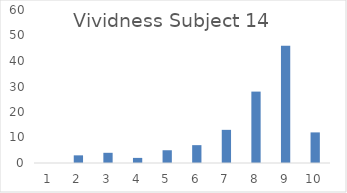
| Category | Frequency |
|---|---|
| 0 | 0 |
| 1 | 3 |
| 2 | 4 |
| 3 | 2 |
| 4 | 5 |
| 5 | 7 |
| 6 | 13 |
| 7 | 28 |
| 8 | 46 |
| 9 | 12 |